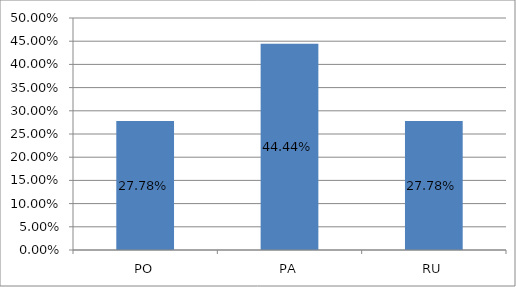
| Category | Series 0 |
|---|---|
| PO | 0.278 |
| PA | 0.444 |
| RU | 0.278 |